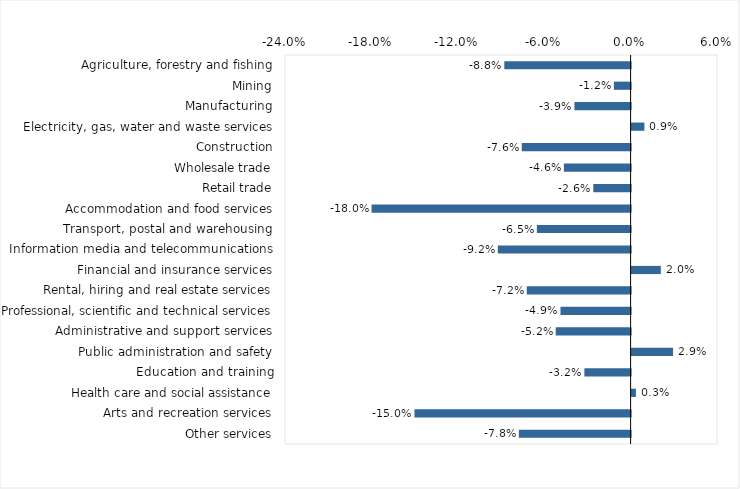
| Category | This week |
|---|---|
| Agriculture, forestry and fishing | -0.088 |
| Mining | -0.012 |
| Manufacturing | -0.039 |
| Electricity, gas, water and waste services | 0.009 |
| Construction | -0.076 |
| Wholesale trade | -0.046 |
| Retail trade | -0.026 |
| Accommodation and food services | -0.18 |
| Transport, postal and warehousing | -0.065 |
| Information media and telecommunications | -0.092 |
| Financial and insurance services | 0.02 |
| Rental, hiring and real estate services | -0.072 |
| Professional, scientific and technical services | -0.049 |
| Administrative and support services | -0.052 |
| Public administration and safety | 0.029 |
| Education and training | -0.032 |
| Health care and social assistance | 0.003 |
| Arts and recreation services | -0.15 |
| Other services | -0.078 |